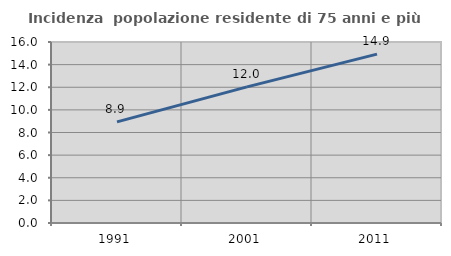
| Category | Incidenza  popolazione residente di 75 anni e più |
|---|---|
| 1991.0 | 8.941 |
| 2001.0 | 12.037 |
| 2011.0 | 14.929 |